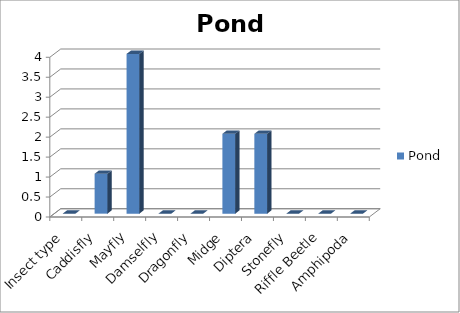
| Category | Pond |
|---|---|
| Insect type | 0 |
| Caddisfly | 1 |
| Mayfly | 4 |
| Damselfly | 0 |
| Dragonfly | 0 |
| Midge | 2 |
| Diptera | 2 |
| Stonefly | 0 |
| Riffle Beetle | 0 |
| Amphipoda | 0 |